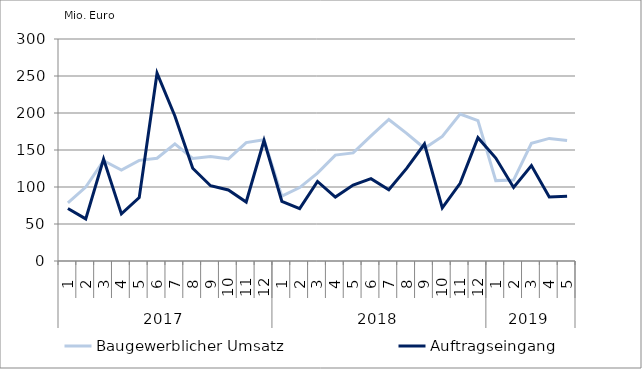
| Category | Baugewerblicher Umsatz | Auftragseingang |
|---|---|---|
| 0 | 78446.78 | 70908.903 |
| 1 | 99841.908 | 56868.408 |
| 2 | 135679.867 | 137790.423 |
| 3 | 123004.403 | 63637.761 |
| 4 | 136010.071 | 85644.63 |
| 5 | 138859.308 | 253791.552 |
| 6 | 158353.879 | 196034.198 |
| 7 | 138510.315 | 125319.873 |
| 8 | 141109.925 | 101690.626 |
| 9 | 138067.098 | 95966.626 |
| 10 | 160064.454 | 79701.993 |
| 11 | 163969.017 | 162878.607 |
| 12 | 87640.529 | 80684.627 |
| 13 | 99259.455 | 70746.763 |
| 14 | 118764.324 | 107538.747 |
| 15 | 143144.178 | 86374.619 |
| 16 | 146070.782 | 102661.329 |
| 17 | 169150.753 | 111287.709 |
| 18 | 191277.885 | 96286.662 |
| 19 | 172425.535 | 125142.495 |
| 20 | 152354.98 | 158112.302 |
| 21 | 168372.756 | 71808.619 |
| 22 | 198558.472 | 104904.147 |
| 23 | 189665.914 | 166653.461 |
| 24 | 108616.605 | 139065.287 |
| 25 | 109331.58 | 99318.609 |
| 26 | 159117.81 | 129002.041 |
| 27 | 165654.287 | 86579.2 |
| 28 | 162976.056 | 87644.362 |